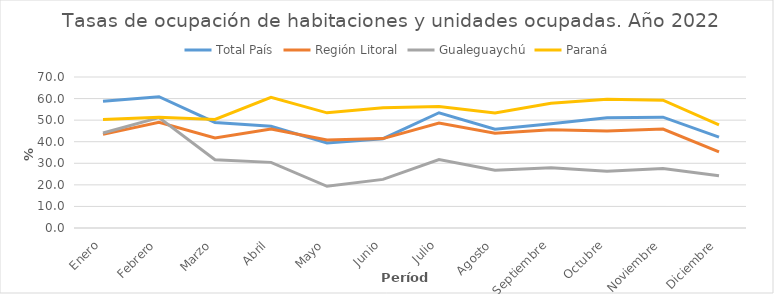
| Category | Total País | Región Litoral | Gualeguaychú | Paraná |
|---|---|---|---|---|
| Enero | 58.746 | 43.409 | 44.018 | 50.35 |
| Febrero | 60.887 | 49.052 | 51.186 | 51.333 |
| Marzo | 48.918 | 41.716 | 31.677 | 50.319 |
| Abril | 47.147 | 45.937 | 30.427 | 60.597 |
| Mayo | 39.428 | 40.786 | 19.315 | 53.379 |
| Junio | 41.396 | 41.456 | 22.543 | 55.702 |
| Julio | 53.426 | 48.641 | 31.765 | 56.33 |
| Agosto | 45.82 | 43.883 | 26.798 | 53.373 |
| Septiembre | 48.281 | 45.595 | 27.922 | 57.852 |
| Octubre | 51.069 | 44.997 | 26.36 | 59.68 |
| Noviembre | 51.377 | 45.881 | 27.618 | 59.227 |
| Diciembre | 42.102 | 35.283 | 24.219 | 47.829 |